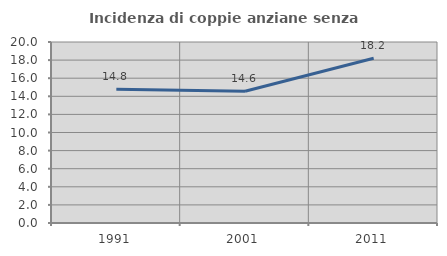
| Category | Incidenza di coppie anziane senza figli  |
|---|---|
| 1991.0 | 14.78 |
| 2001.0 | 14.551 |
| 2011.0 | 18.208 |